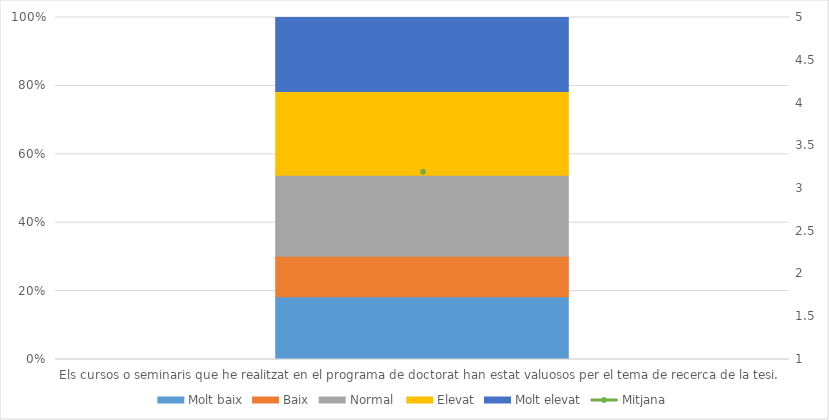
| Category | Molt baix | Baix | Normal  | Elevat | Molt elevat |
|---|---|---|---|---|---|
| Els cursos o seminaris que he realitzat en el programa de doctorat han estat valuosos per el tema de recerca de la tesi. | 45 | 29 | 58 | 60 | 53 |